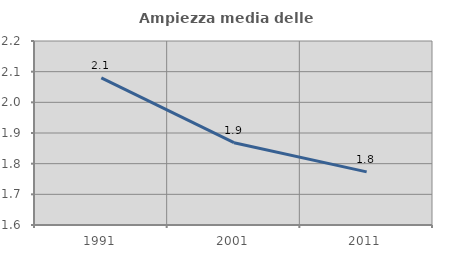
| Category | Ampiezza media delle famiglie |
|---|---|
| 1991.0 | 2.079 |
| 2001.0 | 1.868 |
| 2011.0 | 1.773 |